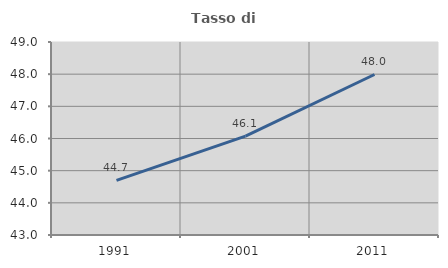
| Category | Tasso di occupazione   |
|---|---|
| 1991.0 | 44.697 |
| 2001.0 | 46.075 |
| 2011.0 | 47.99 |